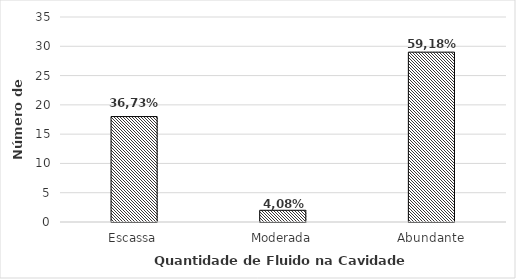
| Category | N° de indíviduos |
|---|---|
| Escassa | 18 |
| Moderada | 2 |
| Abundante | 29 |